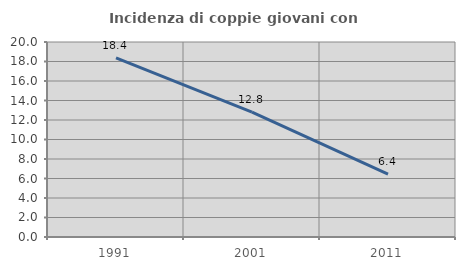
| Category | Incidenza di coppie giovani con figli |
|---|---|
| 1991.0 | 18.362 |
| 2001.0 | 12.815 |
| 2011.0 | 6.446 |